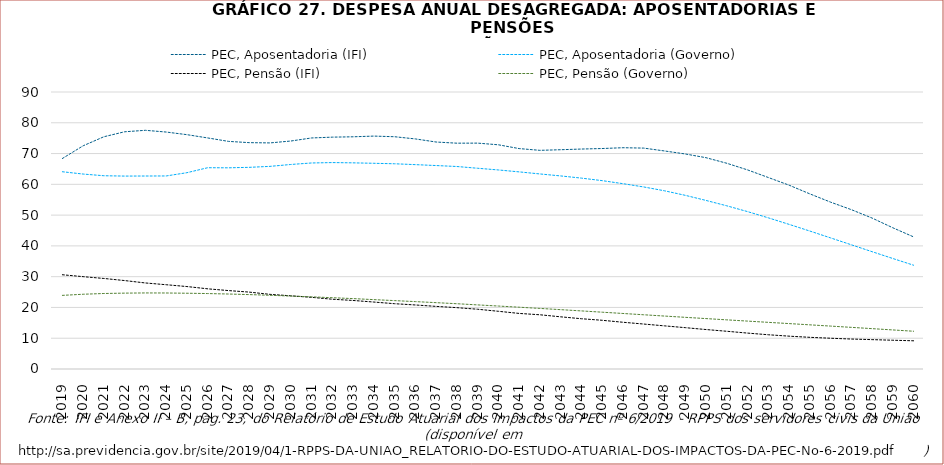
| Category | PEC, Aposentadoria (IFI) | PEC, Aposentadoria (Governo)
 | PEC, Pensão (IFI) | PEC, Pensão (Governo) |
|---|---|---|---|---|
| 2019.0 | 68398184606.753 | 64092636103.197 | 30622747353.357 | 23924747542.511 |
| 2020.0 | 72524253313.079 | 63339065786.812 | 30004353413.906 | 24289403148.534 |
| 2021.0 | 75463946623.48 | 62790247211.981 | 29416341692.708 | 24533565928.634 |
| 2022.0 | 77076812773.734 | 62680980794.014 | 28733455284.808 | 24652007390.667 |
| 2023.0 | 77554216958.135 | 62702862225.638 | 27952182558.817 | 24710828753.845 |
| 2024.0 | 76988846370.48 | 62721511183.73 | 27382052045.075 | 24696459269.939 |
| 2025.0 | 76135179284.941 | 63782936182.815 | 26787283152.415 | 24616833638.604 |
| 2026.0 | 75071663781.726 | 65398007702.604 | 26051103021.569 | 24513097246.34 |
| 2027.0 | 73957365954.713 | 65365782651.209 | 25479803725.46 | 24362676491.639 |
| 2028.0 | 73543874632.026 | 65521254733.647 | 24984187492.275 | 24174893457.463 |
| 2029.0 | 73458599480.981 | 65835738198.961 | 24253536880.571 | 23955190793.401 |
| 2030.0 | 74068625100.779 | 66450171049.347 | 23780329226.343 | 23704957304.486 |
| 2031.0 | 75065090762.856 | 66937368355.518 | 23283386705.713 | 23440871845.796 |
| 2032.0 | 75332039726.11 | 67069206524.055 | 22672269291.087 | 23161028453.136 |
| 2033.0 | 75444383855.938 | 66981530307.691 | 22270183975.24 | 22873819350.752 |
| 2034.0 | 75675450501.347 | 66835706263.054 | 21753451403.349 | 22538683925.412 |
| 2035.0 | 75466601662.036 | 66682516115.297 | 21216386953.807 | 22221327275.573 |
| 2036.0 | 74754696683.198 | 66399394105.232 | 20805345190.258 | 21896528991.091 |
| 2037.0 | 73747625901.392 | 66104760479.518 | 20346281246.65 | 21556686480.563 |
| 2038.0 | 73369865806.933 | 65793072205.437 | 19927915088.64 | 21208372123.888 |
| 2039.0 | 73390869448.976 | 65224257382.023 | 19420363762.926 | 20827822015.855 |
| 2040.0 | 72846646225.228 | 64671496439.002 | 18749892076.929 | 20457372897.327 |
| 2041.0 | 71615849509.348 | 64045303047.026 | 18058933211.223 | 20076481481.589 |
| 2042.0 | 71046812585.027 | 63375672709.088 | 17617545975.609 | 19684768769.113 |
| 2043.0 | 71244874548.964 | 62728813029.482 | 16954740073.026 | 19281752246.104 |
| 2044.0 | 71465593638.526 | 62019085703.5 | 16331489933.638 | 18872617967.737 |
| 2045.0 | 71635462106.676 | 61199921618.208 | 15827339022.205 | 18457798221.946 |
| 2046.0 | 71895037023.194 | 60217012811.546 | 15186992994.591 | 18040688909.25 |
| 2047.0 | 71773551568.228 | 59148701565.061 | 14606297124.727 | 17619947037.442 |
| 2048.0 | 70845903879.773 | 57901475188.265 | 14017487964.043 | 17202377245.715 |
| 2049.0 | 69868553389.543 | 56430595190.079 | 13434039533.709 | 16789249253.87 |
| 2050.0 | 68652972274.42 | 54769838298.099 | 12822337889.934 | 16379104406.263 |
| 2051.0 | 66848562429.948 | 53021506939.702 | 12259661340.863 | 15969981007.545 |
| 2052.0 | 64692702806.857 | 51140535867.521 | 11667201141.396 | 15563476543.91 |
| 2053.0 | 62221451089.876 | 49118621118.578 | 11127693359.542 | 15159097863.48 |
| 2054.0 | 59731013112.294 | 46997223022.925 | 10672205773.352 | 14754873523.86 |
| 2055.0 | 56904844410.568 | 44824965489.507 | 10291384398.283 | 14349265159.881 |
| 2056.0 | 54214472670.89 | 42599208379.763 | 9996853201.15 | 13941547723.277 |
| 2057.0 | 51774517302.362 | 40357090271.392 | 9733451048.214 | 13530304452.97 |
| 2058.0 | 49038754869.488 | 38113677137.291 | 9541230849.44 | 13114346530.725 |
| 2059.0 | 45879005508.679 | 35898183344.889 | 9346575444.454 | 12693102719.039 |
| 2060.0 | 42920987101.227 | 33719058445.092 | 9165812366.163 | 12266585477.439 |